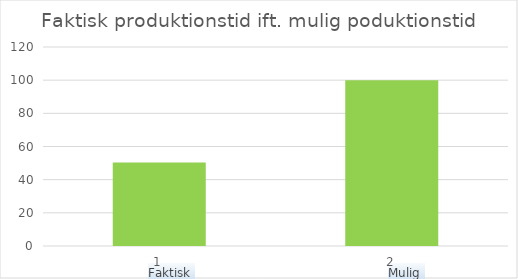
| Category | Series 0 |
|---|---|
| 0 | 50.397 |
| 1 | 100 |